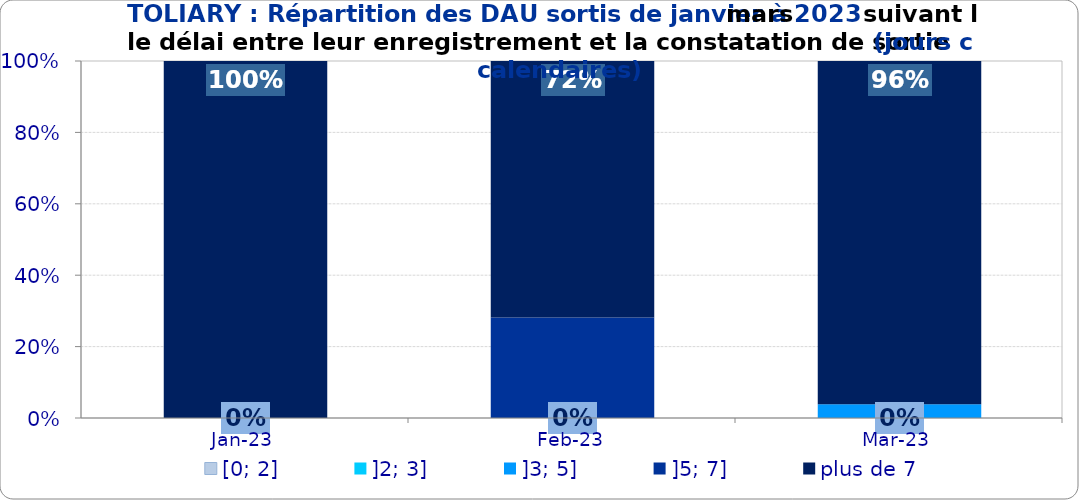
| Category | [0; 2] | ]2; 3] | ]3; 5] | ]5; 7] | plus de 7 |
|---|---|---|---|---|---|
| 2023-01-01 | 0 | 0 | 0 | 0 | 1 |
| 2023-02-01 | 0 | 0 | 0 | 0.281 | 0.719 |
| 2023-03-01 | 0 | 0 | 0.038 | 0 | 0.962 |